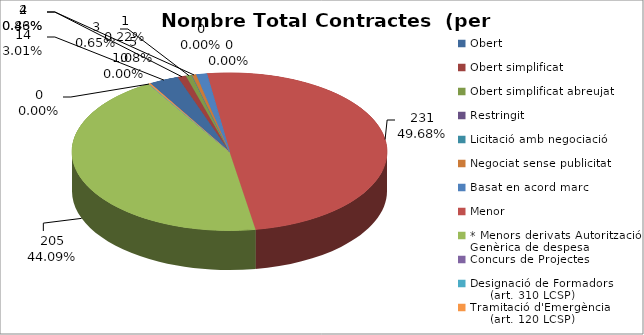
| Category | Nombre Total Contractes |
|---|---|
| Obert | 14 |
| Obert simplificat | 4 |
| Obert simplificat abreujat | 3 |
| Restringit | 0 |
| Licitació amb negociació | 0 |
| Negociat sense publicitat | 2 |
| Basat en acord marc | 5 |
| Menor | 231 |
| * Menors derivats Autorització Genèrica de despesa | 205 |
| Concurs de Projectes | 0 |
| Designació de Formadors
     (art. 310 LCSP) | 0 |
| Tramitació d'Emergència
     (art. 120 LCSP) | 1 |